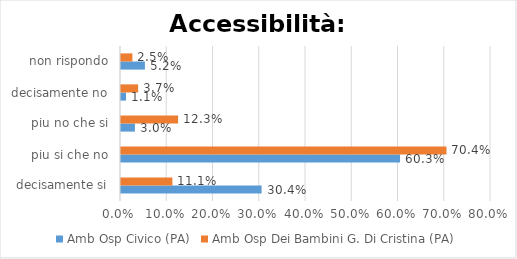
| Category | Amb Osp Civico (PA) | Amb Osp Dei Bambini G. Di Cristina (PA) |
|---|---|---|
| decisamente si | 0.304 | 0.111 |
| piu si che no | 0.603 | 0.704 |
| piu no che si | 0.03 | 0.123 |
| decisamente no | 0.011 | 0.037 |
| non rispondo | 0.052 | 0.025 |